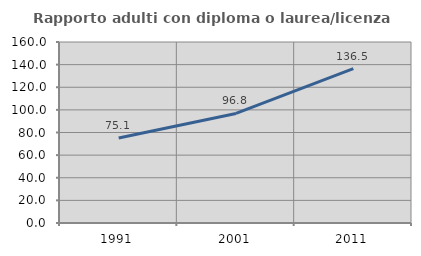
| Category | Rapporto adulti con diploma o laurea/licenza media  |
|---|---|
| 1991.0 | 75.125 |
| 2001.0 | 96.842 |
| 2011.0 | 136.451 |